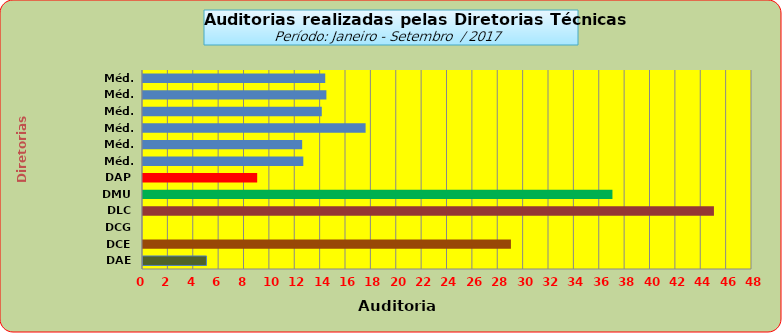
| Category | Series 0 |
|---|---|
| DAE | 5 |
| DCE | 29 |
| DCG | 0 |
| DLC | 45 |
| DMU | 37 |
| DAP | 9 |
| Méd. 2011 | 12.636 |
| Méd. 2012 | 12.545 |
| Méd. 2013 | 17.545 |
| Méd. 2014 | 14.091 |
| Méd. 2015 | 14.455 |
| Méd. 2016 | 14.364 |